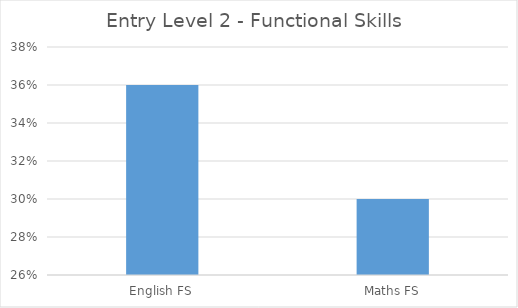
| Category | Entry Level 2 |
|---|---|
| English FS | 0.36 |
| Maths FS | 0.3 |